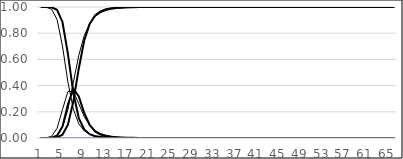
| Category | 0 - published | 1 - published | 2 - published | 0 - MN | 1 - MN | 2 - MN | 0 - MA SESAW | 1 - MA SESAW | 2 - MA SESAW | 0 - RI | 1 - RI | 2 - RI | 0 - updated | 1 - updated | 2 - updated |
|---|---|---|---|---|---|---|---|---|---|---|---|---|---|---|---|
| 0 | 1 | 0 | 0 | 0 | 0 | 0 | 0 | 0 | 0 | 0 | 0 | 0 | 1 | 0 | 0 |
| 1 | 0.999 | 0.001 | 0 | 0 | 0 | 0 | 0 | 0 | 0 | 0 | 0 | 0 | 1 | 0 | 0 |
| 2 | 0.983 | 0.013 | 0.004 | 0 | 0 | 0 | 0 | 0 | 0 | 0 | 0 | 0 | 0.998 | 0.002 | 0 |
| 3 | 0.906 | 0.073 | 0.021 | 0 | 0 | 0 | 0 | 0 | 0 | 0 | 0 | 0 | 0.979 | 0.017 | 0.004 |
| 4 | 0.702 | 0.217 | 0.081 | 0 | 0 | 0 | 0 | 0 | 0 | 0 | 0 | 0 | 0.886 | 0.089 | 0.026 |
| 5 | 0.427 | 0.355 | 0.218 | 0 | 0 | 0 | 0 | 0 | 0 | 0 | 0 | 0 | 0.643 | 0.256 | 0.101 |
| 6 | 0.22 | 0.356 | 0.424 | 0 | 0 | 0 | 0 | 0 | 0 | 0 | 0 | 0 | 0.344 | 0.377 | 0.28 |
| 7 | 0.108 | 0.261 | 0.631 | 0 | 0 | 0 | 0 | 0 | 0 | 0 | 0 | 0 | 0.152 | 0.317 | 0.531 |
| 8 | 0.055 | 0.163 | 0.782 | 0 | 0 | 0 | 0 | 0 | 0 | 0 | 0 | 0 | 0.065 | 0.191 | 0.744 |
| 9 | 0.029 | 0.097 | 0.875 | 0 | 0 | 0 | 0 | 0 | 0 | 0 | 0 | 0 | 0.029 | 0.1 | 0.871 |
| 10 | 0.016 | 0.057 | 0.927 | 0 | 0 | 0 | 0 | 0 | 0 | 0 | 0 | 0 | 0.014 | 0.051 | 0.936 |
| 11 | 0.009 | 0.034 | 0.957 | 0 | 0 | 0 | 0 | 0 | 0 | 0 | 0 | 0 | 0.007 | 0.026 | 0.967 |
| 12 | 0.006 | 0.021 | 0.973 | 0 | 0 | 0 | 0 | 0 | 0 | 0 | 0 | 0 | 0.004 | 0.014 | 0.982 |
| 13 | 0.004 | 0.013 | 0.983 | 0 | 0 | 0 | 0 | 0 | 0 | 0 | 0 | 0 | 0.002 | 0.008 | 0.99 |
| 14 | 0.002 | 0.009 | 0.989 | 0 | 0 | 0 | 0 | 0 | 0 | 0 | 0 | 0 | 0.001 | 0.005 | 0.994 |
| 15 | 0.002 | 0.006 | 0.993 | 0 | 0 | 0 | 0 | 0 | 0 | 0 | 0 | 0 | 0.001 | 0.003 | 0.997 |
| 16 | 0.001 | 0.004 | 0.995 | 0 | 0 | 0 | 0 | 0 | 0 | 0 | 0 | 0 | 0 | 0.002 | 0.998 |
| 17 | 0.001 | 0.003 | 0.996 | 0 | 0 | 0 | 0 | 0 | 0 | 0 | 0 | 0 | 0 | 0.001 | 0.999 |
| 18 | 0.001 | 0.002 | 0.997 | 0 | 0 | 0 | 0 | 0 | 0 | 0 | 0 | 0 | 0 | 0.001 | 0.999 |
| 19 | 0 | 0.001 | 0.998 | 0 | 0 | 0 | 0 | 0 | 0 | 0 | 0 | 0 | 0 | 0 | 0.999 |
| 20 | 0 | 0.001 | 0.999 | 0 | 0 | 0 | 0 | 0 | 0 | 0 | 0 | 0 | 0 | 0 | 1 |
| 21 | 0 | 0.001 | 0.999 | 0 | 0 | 0 | 0 | 0 | 0 | 0 | 0 | 0 | 0 | 0 | 1 |
| 22 | 0 | 0.001 | 0.999 | 0 | 0 | 0 | 0 | 0 | 0 | 0 | 0 | 0 | 0 | 0 | 1 |
| 23 | 0 | 0 | 0.999 | 0 | 0 | 0 | 0 | 0 | 0 | 0 | 0 | 0 | 0 | 0 | 1 |
| 24 | 0 | 0 | 1 | 0 | 0 | 0 | 0 | 0 | 0 | 0 | 0 | 0 | 0 | 0 | 1 |
| 25 | 0 | 0 | 1 | 0 | 0 | 0 | 0 | 0 | 0 | 0 | 0 | 0 | 0 | 0 | 1 |
| 26 | 0 | 0 | 1 | 0 | 0 | 0 | 0 | 0 | 0 | 0 | 0 | 0 | 0 | 0 | 1 |
| 27 | 0 | 0 | 1 | 0 | 0 | 0 | 0 | 0 | 0 | 0 | 0 | 0 | 0 | 0 | 1 |
| 28 | 0 | 0 | 1 | 0 | 0 | 0 | 0 | 0 | 0 | 0 | 0 | 0 | 0 | 0 | 1 |
| 29 | 0 | 0 | 1 | 0 | 0 | 0 | 0 | 0 | 0 | 0 | 0 | 0 | 0 | 0 | 1 |
| 30 | 0 | 0 | 1 | 0 | 0 | 0 | 0 | 0 | 0 | 0 | 0 | 0 | 0 | 0 | 1 |
| 31 | 0 | 0 | 1 | 0 | 0 | 0 | 0 | 0 | 0 | 0 | 0 | 0 | 0 | 0 | 1 |
| 32 | 0 | 0 | 1 | 0 | 0 | 0 | 0 | 0 | 0 | 0 | 0 | 0 | 0 | 0 | 1 |
| 33 | 0 | 0 | 1 | 0 | 0 | 0 | 0 | 0 | 0 | 0 | 0 | 0 | 0 | 0 | 1 |
| 34 | 0 | 0 | 1 | 0 | 0 | 0 | 0 | 0 | 0 | 0 | 0 | 0 | 0 | 0 | 1 |
| 35 | 0 | 0 | 1 | 0 | 0 | 0 | 0 | 0 | 0 | 0 | 0 | 0 | 0 | 0 | 1 |
| 36 | 0 | 0 | 1 | 0 | 0 | 0 | 0 | 0 | 0 | 0 | 0 | 0 | 0 | 0 | 1 |
| 37 | 0 | 0 | 1 | 0 | 0 | 0 | 0 | 0 | 0 | 0 | 0 | 0 | 0 | 0 | 1 |
| 38 | 0 | 0 | 1 | 0 | 0 | 0 | 0 | 0 | 0 | 0 | 0 | 0 | 0 | 0 | 1 |
| 39 | 0 | 0 | 1 | 0 | 0 | 0 | 0 | 0 | 0 | 0 | 0 | 0 | 0 | 0 | 1 |
| 40 | 0 | 0 | 1 | 0 | 0 | 0 | 0 | 0 | 0 | 0 | 0 | 0 | 0 | 0 | 1 |
| 41 | 0 | 0 | 1 | 0 | 0 | 0 | 0 | 0 | 0 | 0 | 0 | 0 | 0 | 0 | 1 |
| 42 | 0 | 0 | 1 | 0 | 0 | 0 | 0 | 0 | 0 | 0 | 0 | 0 | 0 | 0 | 1 |
| 43 | 0 | 0 | 1 | 0 | 0 | 0 | 0 | 0 | 0 | 0 | 0 | 0 | 0 | 0 | 1 |
| 44 | 0 | 0 | 1 | 0 | 0 | 0 | 0 | 0 | 0 | 0 | 0 | 0 | 0 | 0 | 1 |
| 45 | 0 | 0 | 1 | 0 | 0 | 0 | 0 | 0 | 0 | 0 | 0 | 0 | 0 | 0 | 1 |
| 46 | 0 | 0 | 1 | 0 | 0 | 0 | 0 | 0 | 0 | 0 | 0 | 0 | 0 | 0 | 1 |
| 47 | 0 | 0 | 1 | 0 | 0 | 0 | 0 | 0 | 0 | 0 | 0 | 0 | 0 | 0 | 1 |
| 48 | 0 | 0 | 1 | 0 | 0 | 0 | 0 | 0 | 0 | 0 | 0 | 0 | 0 | 0 | 1 |
| 49 | 0 | 0 | 1 | 0 | 0 | 0 | 0 | 0 | 0 | 0 | 0 | 0 | 0 | 0 | 1 |
| 50 | 0 | 0 | 1 | 0 | 0 | 0 | 0 | 0 | 0 | 0 | 0 | 0 | 0 | 0 | 1 |
| 51 | 0 | 0 | 1 | 0 | 0 | 0 | 0 | 0 | 0 | 0 | 0 | 0 | 0 | 0 | 1 |
| 52 | 0 | 0 | 1 | 0 | 0 | 0 | 0 | 0 | 0 | 0 | 0 | 0 | 0 | 0 | 1 |
| 53 | 0 | 0 | 1 | 0 | 0 | 0 | 0 | 0 | 0 | 0 | 0 | 0 | 0 | 0 | 1 |
| 54 | 0 | 0 | 1 | 0 | 0 | 0 | 0 | 0 | 0 | 0 | 0 | 0 | 0 | 0 | 1 |
| 55 | 0 | 0 | 1 | 0 | 0 | 0 | 0 | 0 | 0 | 0 | 0 | 0 | 0 | 0 | 1 |
| 56 | 0 | 0 | 1 | 0 | 0 | 0 | 0 | 0 | 0 | 0 | 0 | 0 | 0 | 0 | 1 |
| 57 | 0 | 0 | 1 | 0 | 0 | 0 | 0 | 0 | 0 | 0 | 0 | 0 | 0 | 0 | 1 |
| 58 | 0 | 0 | 1 | 0 | 0 | 0 | 0 | 0 | 0 | 0 | 0 | 0 | 0 | 0 | 1 |
| 59 | 0 | 0 | 1 | 0 | 0 | 0 | 0 | 0 | 0 | 0 | 0 | 0 | 0 | 0 | 1 |
| 60 | 0 | 0 | 1 | 0 | 0 | 0 | 0 | 0 | 0 | 0 | 0 | 0 | 0 | 0 | 1 |
| 61 | 0 | 0 | 1 | 0 | 0 | 0 | 0 | 0 | 0 | 0 | 0 | 0 | 0 | 0 | 1 |
| 62 | 0 | 0 | 1 | 0 | 0 | 0 | 0 | 0 | 0 | 0 | 0 | 0 | 0 | 0 | 1 |
| 63 | 0 | 0 | 1 | 0 | 0 | 0 | 0 | 0 | 0 | 0 | 0 | 0 | 0 | 0 | 1 |
| 64 | 0 | 0 | 1 | 0 | 0 | 0 | 0 | 0 | 0 | 0 | 0 | 0 | 0 | 0 | 1 |
| 65 | 0 | 0 | 1 | 0 | 0 | 0 | 0 | 0 | 0 | 0 | 0 | 0 | 0 | 0 | 1 |